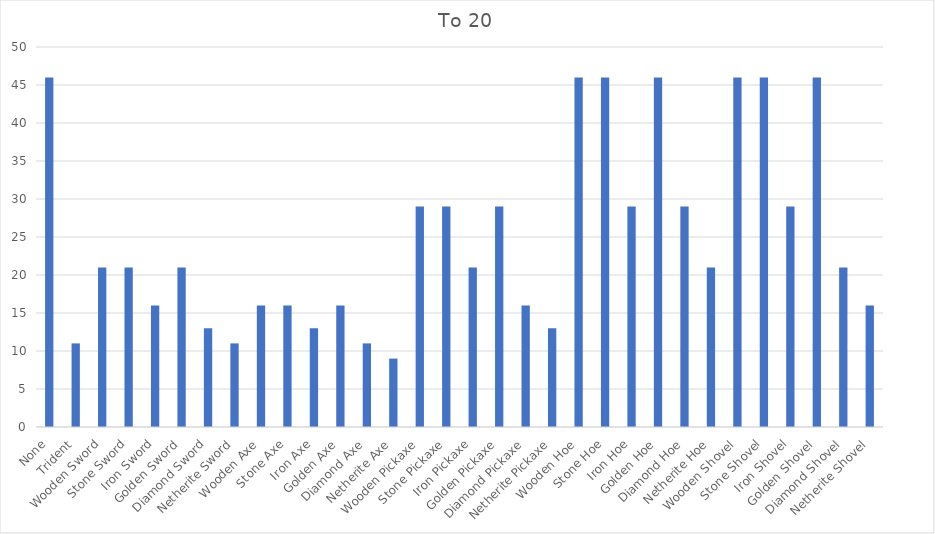
| Category | To 20 |
|---|---|
| None | 46 |
| Trident | 11 |
| Wooden Sword | 21 |
| Stone Sword | 21 |
| Iron Sword | 16 |
| Golden Sword | 21 |
| Diamond Sword | 13 |
| Netherite Sword | 11 |
| Wooden Axe | 16 |
| Stone Axe | 16 |
| Iron Axe | 13 |
| Golden Axe | 16 |
| Diamond Axe | 11 |
| Netherite Axe | 9 |
| Wooden Pickaxe | 29 |
| Stone Pickaxe | 29 |
| Iron Pickaxe | 21 |
| Golden Pickaxe | 29 |
| Diamond Pickaxe | 16 |
| Netherite Pickaxe | 13 |
| Wooden Hoe | 46 |
| Stone Hoe | 46 |
| Iron Hoe | 29 |
| Golden Hoe | 46 |
| Diamond Hoe | 29 |
| Netherite Hoe | 21 |
| Wooden Shovel | 46 |
| Stone Shovel | 46 |
| Iron Shovel | 29 |
| Golden Shovel | 46 |
| Diamond Shovel | 21 |
| Netherite Shovel | 16 |